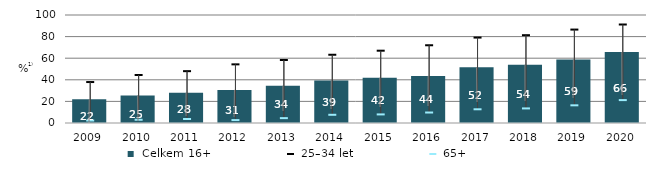
| Category |  Celkem 16+ |
|---|---|
| 2009.0 | 22 |
| 2010.0 | 25.4 |
| 2011.0 | 28 |
| 2012.0 | 30.645 |
| 2013.0 | 34.44 |
| 2014.0 | 39.287 |
| 2015.0 | 41.853 |
| 2016.0 | 43.626 |
| 2017.0 | 51.6 |
| 2018.0 | 53.9 |
| 2019.0 | 58.8 |
| 2020.0 | 65.7 |